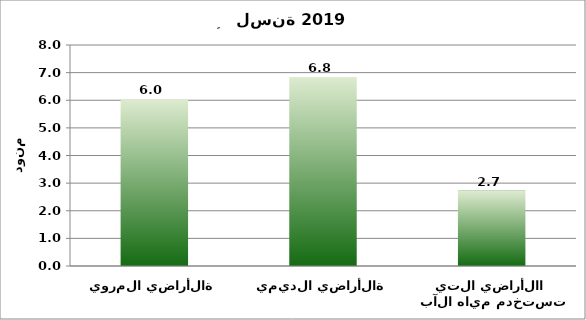
| Category | Series 0 |
|---|---|
| الأراضي المروية | 6.03 |
| الأراضي الديمية | 6.838 |
| الأراضي التي تستخدم مياه الآبار | 2.722 |